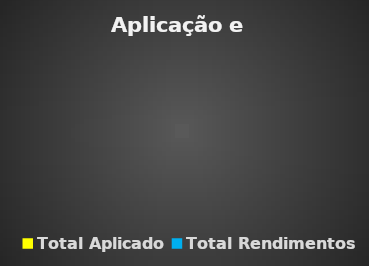
| Category | Series 0 |
|---|---|
| Total Aplicado | 0 |
| Total Rendimentos | 0 |